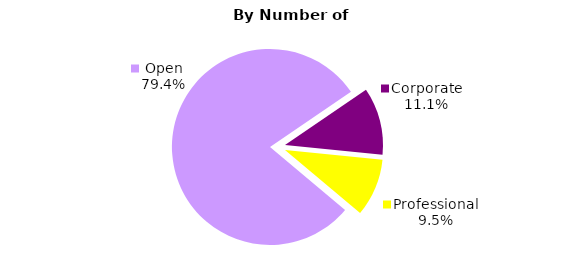
| Category | Series 0 |
|---|---|
| Open | 50 |
| Corporate | 7 |
| Professional | 6 |